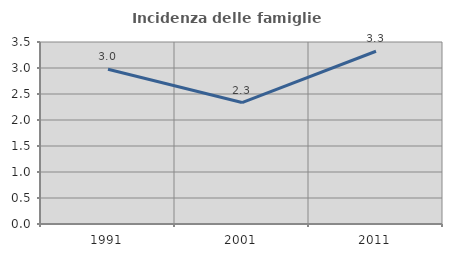
| Category | Incidenza delle famiglie numerose |
|---|---|
| 1991.0 | 2.977 |
| 2001.0 | 2.335 |
| 2011.0 | 3.322 |